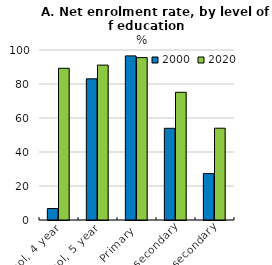
| Category | 2000 | 2020 |
|---|---|---|
| Preschool, 4 year | 6.722 | 89.25 |
| Preschool, 5 year | 83.037 | 91.115 |
| Primary | 96.536 | 95.521 |
| Lower secondary | 53.934 | 75.128 |
| Upper secondary | 27.285 | 54.001 |